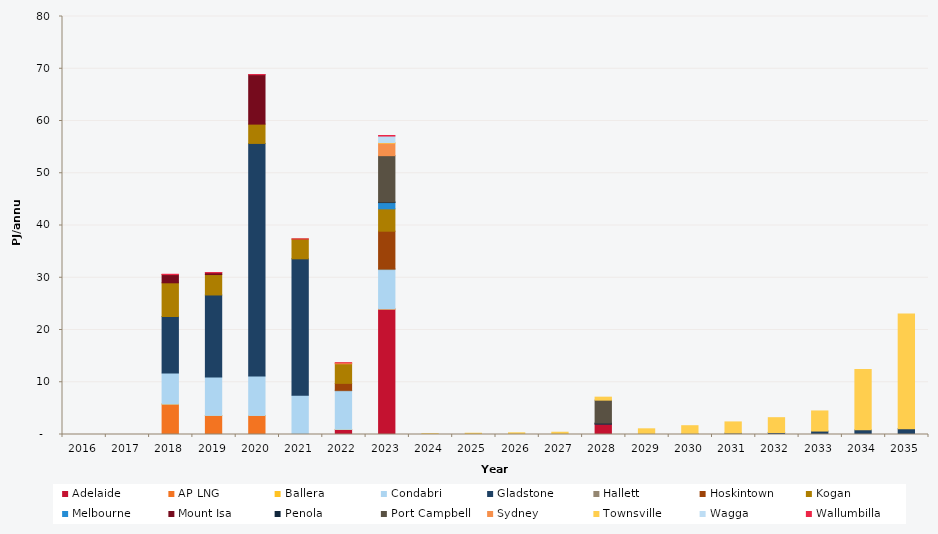
| Category | Adelaide | AP LNG | Ballera | Condabri | Gladstone | Hallett | Hoskintown | Kogan | Melbourne | Mount Isa | Penola | Port Campbell | Sydney | Townsville | Wagga | Wallumbilla |
|---|---|---|---|---|---|---|---|---|---|---|---|---|---|---|---|---|
| 2016.0 | 0 | 0 | 0 | 0 | 0 | 0 | 0 | 0 | 0 | 0 | 0 | 0 | 0 | 0 | 0 | 0 |
| 2017.0 | 0 | 0 | 0 | 0 | 0 | 0 | 0 | 0 | 0 | 0 | 0 | 0 | 0 | 0 | 0 | 0 |
| 2018.0 | 0 | 5.832 | 0.002 | 5.927 | 10.819 | 0 | 0 | 6.453 | 0 | 1.581 | 0 | 0 | 0 | 0 | 0 | 0.051 |
| 2019.0 | 0 | 3.637 | 0.017 | 7.374 | 15.676 | 0 | 0 | 3.909 | 0 | 0.337 | 0 | 0 | 0 | 0 | 0 | 0.032 |
| 2020.0 | 0 | 3.637 | 0.008 | 7.562 | 44.501 | 0 | 0 | 3.697 | 0 | 9.456 | 0 | 0 | 0 | 0 | 0 | 0.014 |
| 2021.0 | 0 | 0 | 0.021 | 7.509 | 26.092 | 0 | 0 | 3.785 | 0 | 0 | 0 | 0 | 0 | 0 | 0 | 0.031 |
| 2022.0 | 0.962 | 0 | 0.027 | 7.387 | 0 | 0.093 | 1.317 | 3.742 | 0 | 0 | 0 | 0 | 0.138 | 0.017 | 0 | 0.055 |
| 2023.0 | 24.004 | 0 | 0.041 | 7.52 | 0 | 0.153 | 7.19 | 4.279 | 1.2 | 0 | 0.109 | 8.869 | 2.405 | 0.113 | 1.239 | 0.103 |
| 2024.0 | 0 | 0 | 0 | 0 | 0 | 0 | 0 | 0 | 0 | 0 | 0 | 0 | 0 | 0.155 | 0 | 0 |
| 2025.0 | 0 | 0 | 0 | 0 | 0 | 0 | 0 | 0 | 0 | 0 | 0 | 0 | 0 | 0.24 | 0 | 0 |
| 2026.0 | 0 | 0 | 0 | 0 | 0 | 0 | 0 | 0 | 0 | 0 | 0 | 0 | 0 | 0.322 | 0 | 0 |
| 2027.0 | 0 | 0 | 0 | 0 | 0 | 0 | 0 | 0 | 0 | 0 | 0 | 0 | 0 | 0.434 | 0 | 0 |
| 2028.0 | 2.018 | 0 | 0 | 0 | 0.001 | 0 | 0 | 0 | 0 | 0 | 0.167 | 4.385 | 0 | 0.573 | 0 | 0 |
| 2029.0 | 0 | 0 | 0 | 0 | 0.006 | 0 | 0 | 0 | 0 | 0 | 0 | 0 | 0 | 1.081 | 0 | 0 |
| 2030.0 | 0 | 0 | 0 | 0 | 0.084 | 0 | 0 | 0 | 0 | 0 | 0 | 0 | 0 | 1.598 | 0 | 0 |
| 2031.0 | 0 | 0 | 0 | 0 | 0.262 | 0 | 0 | 0 | 0 | 0 | 0 | 0 | 0 | 2.145 | 0 | 0 |
| 2032.0 | 0 | 0 | 0 | 0 | 0.386 | 0 | 0 | 0 | 0 | 0 | 0 | 0 | 0 | 2.833 | 0 | 0 |
| 2033.0 | 0 | 0 | 0 | 0 | 0.658 | 0 | 0 | 0 | 0 | 0 | 0 | 0 | 0 | 3.847 | 0 | 0 |
| 2034.0 | 0 | 0 | 0 | 0 | 0.888 | 0 | 0 | 0 | 0 | 0 | 0 | 0 | 0 | 11.54 | 0 | 0 |
| 2035.0 | 0 | 0 | 0 | 0 | 1.124 | 0 | 0 | 0 | 0 | 0 | 0 | 0 | 0 | 21.953 | 0 | 0 |